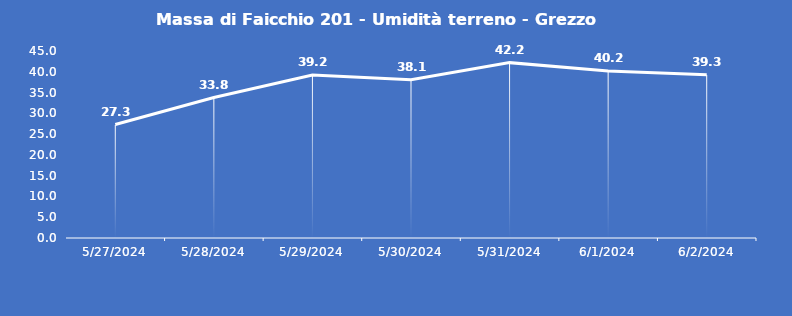
| Category | Massa di Faicchio 201 - Umidità terreno - Grezzo (%VWC) |
|---|---|
| 5/27/24 | 27.3 |
| 5/28/24 | 33.8 |
| 5/29/24 | 39.2 |
| 5/30/24 | 38.1 |
| 5/31/24 | 42.2 |
| 6/1/24 | 40.2 |
| 6/2/24 | 39.3 |